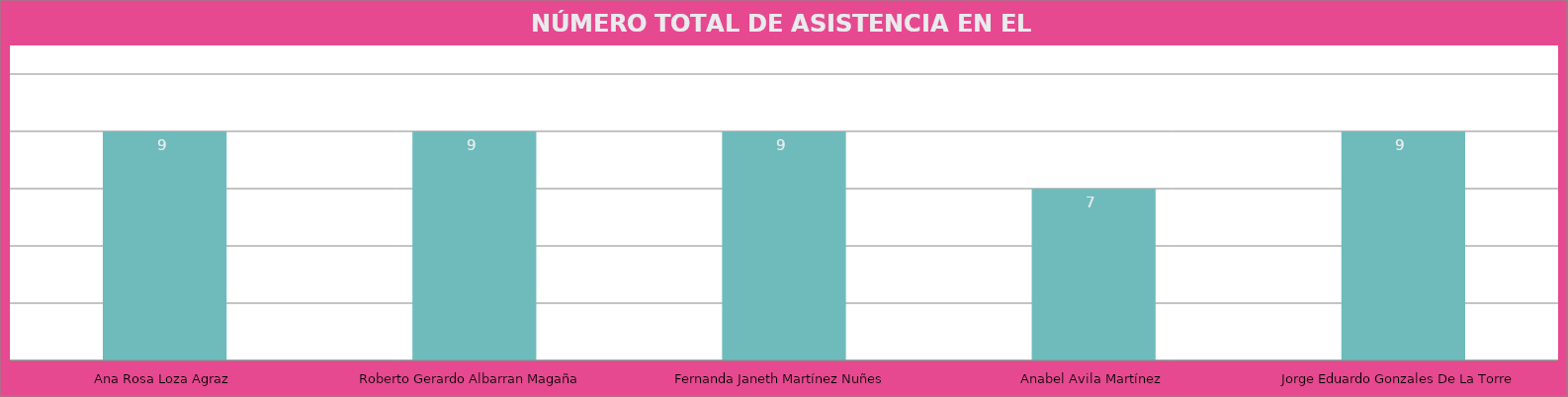
| Category | Ana Rosa Loza Agraz |
|---|---|
| Ana Rosa Loza Agraz | 9 |
| Roberto Gerardo Albarran Magaña | 9 |
| Fernanda Janeth Martínez Nuñes | 9 |
| Anabel Avila Martínez | 7 |
| Jorge Eduardo Gonzales De La Torre | 9 |